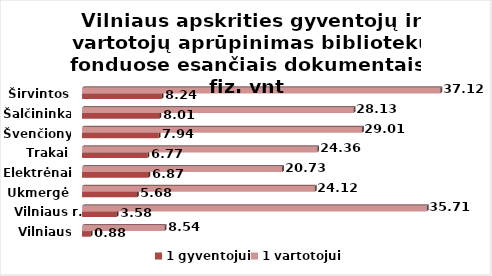
| Category | 1 gyventojui | 1 vartotojui |
|---|---|---|
| Vilniaus m. | 0.88 | 8.54 |
| Vilniaus r. | 3.58 | 35.71 |
| Ukmergė | 5.68 | 24.12 |
| Elektrėnai | 6.87 | 20.73 |
| Trakai | 6.77 | 24.36 |
| Švenčionys | 7.94 | 29.01 |
| Šalčininkai | 8.01 | 28.13 |
| Širvintos | 8.24 | 37.12 |